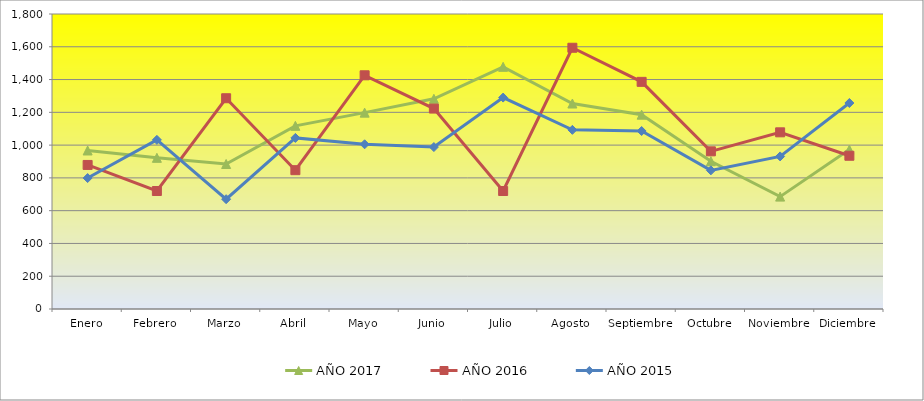
| Category | AÑO 2017 | AÑO 2016 | AÑO 2015 |
|---|---|---|---|
| Enero | 967.164 | 879 | 799 |
| Febrero | 922.388 | 720 | 1032 |
| Marzo | 884.776 | 1286 | 670 |
| Abril | 1117.612 | 847 | 1044 |
| Mayo | 1198.209 | 1426 | 1005 |
| Junio | 1282.388 | 1223 | 988 |
| Julio | 1477.612 | 720 | 1290 |
| Agosto | 1253.731 | 1594 | 1093 |
| Septiembre | 1185.672 | 1386 | 1086 |
| Octubre | 901.714 | 962 | 846 |
| Noviembre | 685.714 | 1078 | 931 |
| Diciembre | 972.537 | 935 | 1257 |